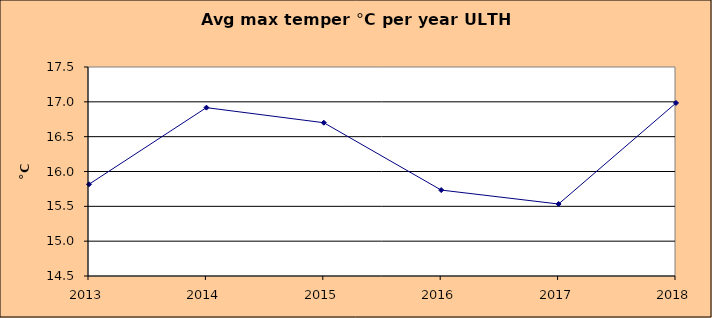
| Category | Series 0 |
|---|---|
| 2013.0 | 15.817 |
| 2014.0 | 16.917 |
| 2015.0 | 16.7 |
| 2016.0 | 15.733 |
| 2017.0 | 15.533 |
| 2018.0 | 16.983 |